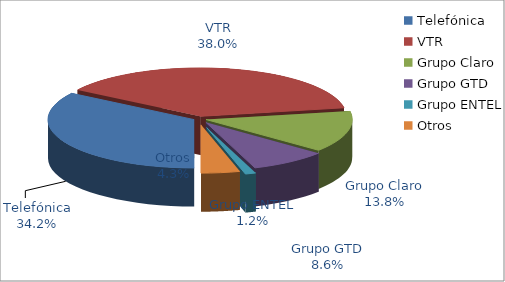
| Category | Series 0 |
|---|---|
| Telefónica | 1047604 |
| VTR | 1164537 |
| Grupo Claro | 423692 |
| Grupo GTD | 262077 |
| Grupo ENTEL | 35969 |
| Otros | 131115 |